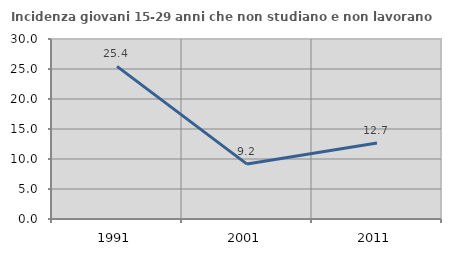
| Category | Incidenza giovani 15-29 anni che non studiano e non lavorano  |
|---|---|
| 1991.0 | 25.439 |
| 2001.0 | 9.15 |
| 2011.0 | 12.662 |